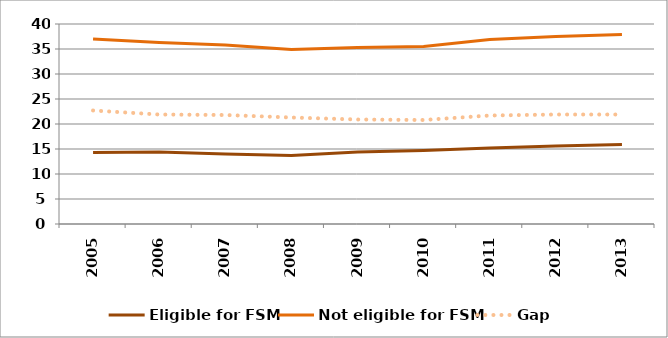
| Category | Eligible for FSM | Not eligible for FSM | Gap |
|---|---|---|---|
| 2005.0 | 14.3 | 37 | 22.7 |
| 2006.0 | 14.4 | 36.3 | 21.9 |
| 2007.0 | 14 | 35.8 | 21.8 |
| 2008.0 | 13.7 | 34.9 | 21.3 |
| 2009.0 | 14.4 | 35.3 | 20.9 |
| 2010.0 | 14.7 | 35.5 | 20.8 |
| 2011.0 | 15.2 | 36.9 | 21.7 |
| 2012.0 | 15.6 | 37.5 | 21.9 |
| 2013.0 | 15.9 | 37.9 | 21.9 |